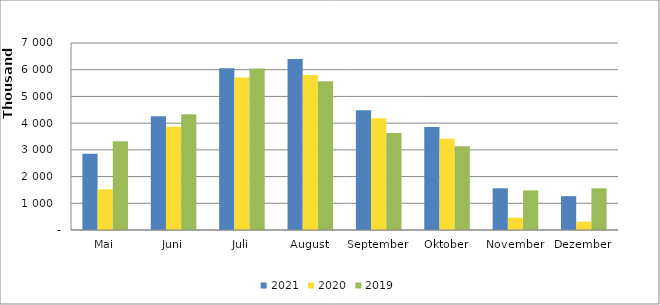
| Category | 2021 | 2020 | 2019 |
|---|---|---|---|
| Mai | 2850171 | 1522840 | 3318785 |
| Juni | 4255276 | 3867643 | 4335688 |
| Juli | 6055301 | 5709434 | 6044743 |
| August | 6400538 | 5802579 | 5567222 |
| September | 4482942 | 4183912 | 3633060 |
| Oktober | 3856933 | 3419058 | 3138683 |
| November | 1561347 | 461976 | 1480784 |
| Dezember | 1267939 | 311727 | 1560219 |